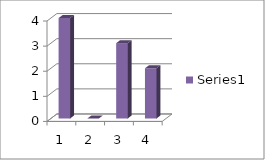
| Category | Series 0 |
|---|---|
| 0 | 4 |
| 1 | 0 |
| 2 | 3 |
| 3 | 2 |